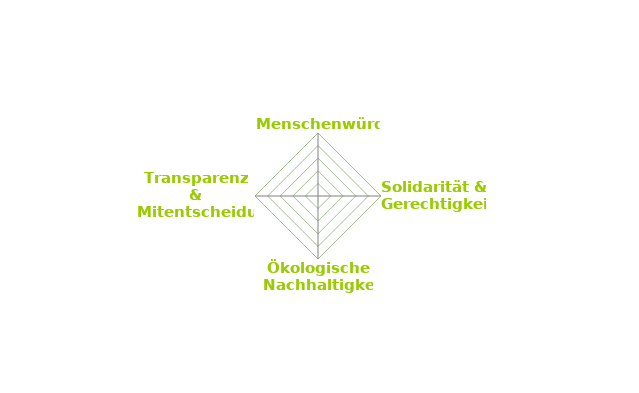
| Category | Series 0 |
|---|---|
| Menschenwürde | 0 |
| Solidarität & Gerechtigkeit | 0 |
| Ökologische Nachhaltigkeit | 0 |
| Transparenz & Mitentscheidung | 0 |